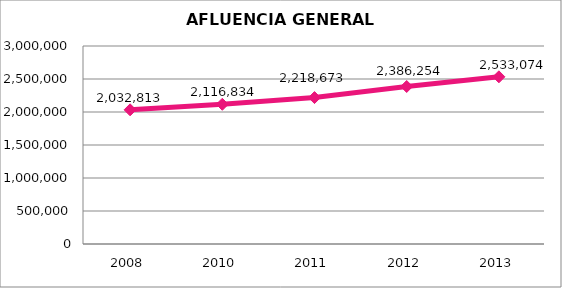
| Category | Series 0 |
|---|---|
| 2008.0 | 2032813 |
| 2010.0 | 2116834 |
| 2011.0 | 2218673 |
| 2012.0 | 2386254 |
| 2013.0 | 2533074 |